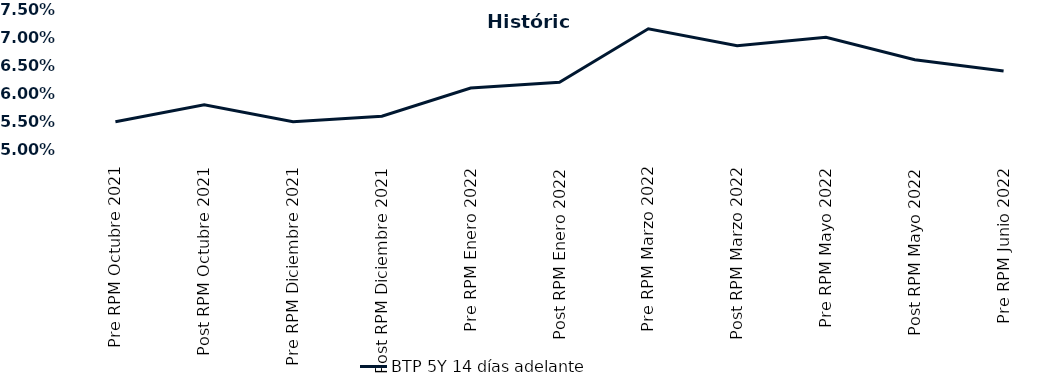
| Category | BTP 5Y 14 días adelante |
|---|---|
| Pre RPM Octubre 2021 | 0.055 |
| Post RPM Octubre 2021 | 0.058 |
| Pre RPM Diciembre 2021 | 0.055 |
| Post RPM Diciembre 2021 | 0.056 |
| Pre RPM Enero 2022 | 0.061 |
| Post RPM Enero 2022 | 0.062 |
| Pre RPM Marzo 2022 | 0.072 |
| Post RPM Marzo 2022 | 0.068 |
| Pre RPM Mayo 2022 | 0.07 |
| Post RPM Mayo 2022 | 0.066 |
| Pre RPM Junio 2022 | 0.064 |